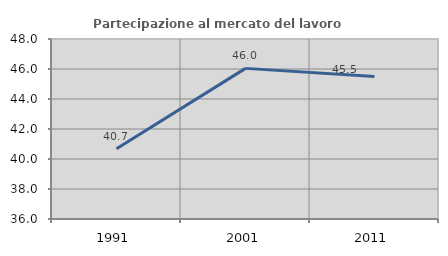
| Category | Partecipazione al mercato del lavoro  femminile |
|---|---|
| 1991.0 | 40.677 |
| 2001.0 | 46.042 |
| 2011.0 | 45.499 |